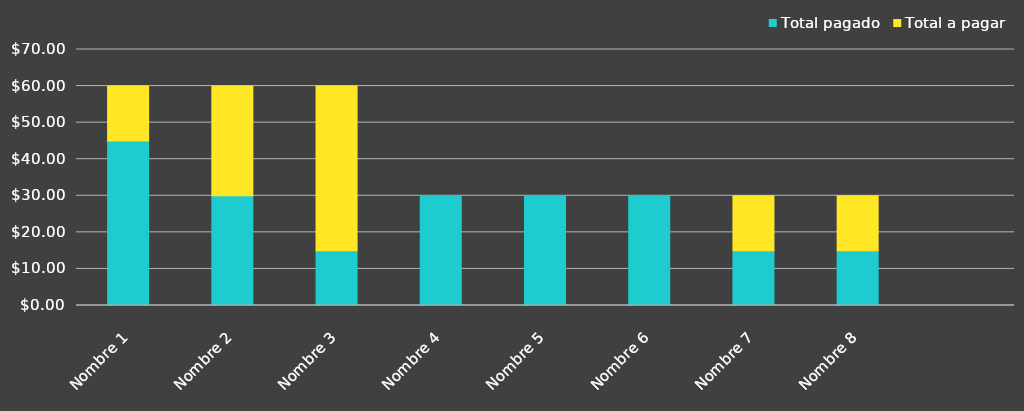
| Category | Total pagado | Total a pagar |
|---|---|---|
| Nombre 1 | 45 | 15 |
| Nombre 2 | 30 | 30 |
| Nombre 3 | 15 | 45 |
| Nombre 4 | 30 | 0 |
| Nombre 5 | 30 | 0 |
| Nombre 6 | 30 | 0 |
| Nombre 7 | 15 | 15 |
| Nombre 8 | 15 | 15 |